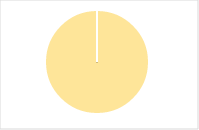
| Category | Total |
|---|---|
| Y | 0 |
| R | 0 |
| T | 0 |
| M | 0 |
| F | 0 |
| N | 60 |